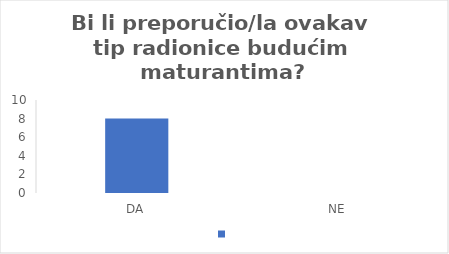
| Category | Series 0 |
|---|---|
| DA | 8 |
| NE | 0 |